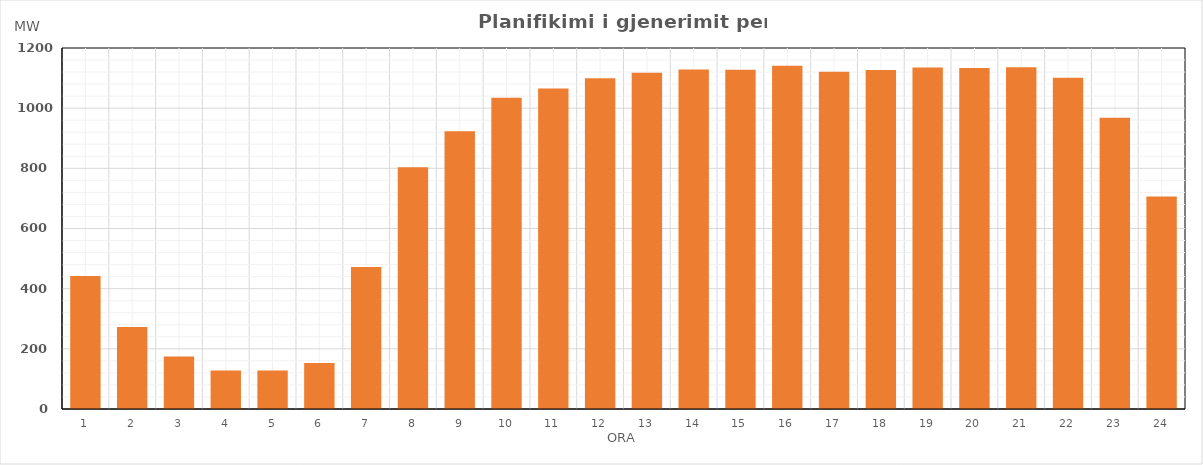
| Category | Max (MW) |
|---|---|
| 0 | 442 |
| 1 | 272.965 |
| 2 | 174.475 |
| 3 | 128.224 |
| 4 | 128.249 |
| 5 | 153.254 |
| 6 | 471.819 |
| 7 | 803.984 |
| 8 | 923.589 |
| 9 | 1034.849 |
| 10 | 1064.994 |
| 11 | 1099.264 |
| 12 | 1118 |
| 13 | 1128.319 |
| 14 | 1127.324 |
| 15 | 1141.178 |
| 16 | 1121.124 |
| 17 | 1127.179 |
| 18 | 1135.294 |
| 19 | 1133.199 |
| 20 | 1136.269 |
| 21 | 1101.264 |
| 22 | 967.805 |
| 23 | 706.085 |